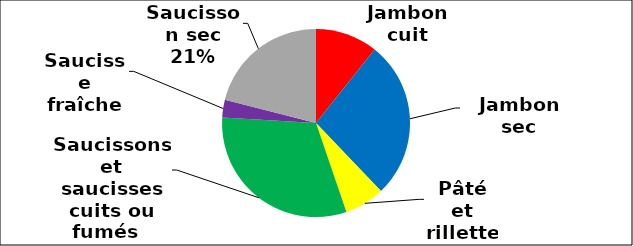
| Category | Series 0 | Series 1 |
|---|---|---|
| Jambon cuit | 3579.65 | 0.107 |
| Jambon sec | 9062.87 | 0.271 |
| Pâté et rillette | 2302.89 | 0.069 |
| Saucissons et saucisses cuits ou fumés  | 10411.98 | 0.312 |
| Saucisse fraîche | 1024.53 | 0.031 |
| Saucisson sec | 7013.62 | 0.21 |